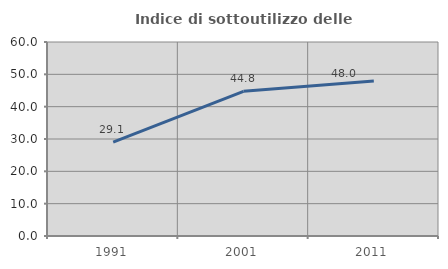
| Category | Indice di sottoutilizzo delle abitazioni  |
|---|---|
| 1991.0 | 29.054 |
| 2001.0 | 44.755 |
| 2011.0 | 47.967 |